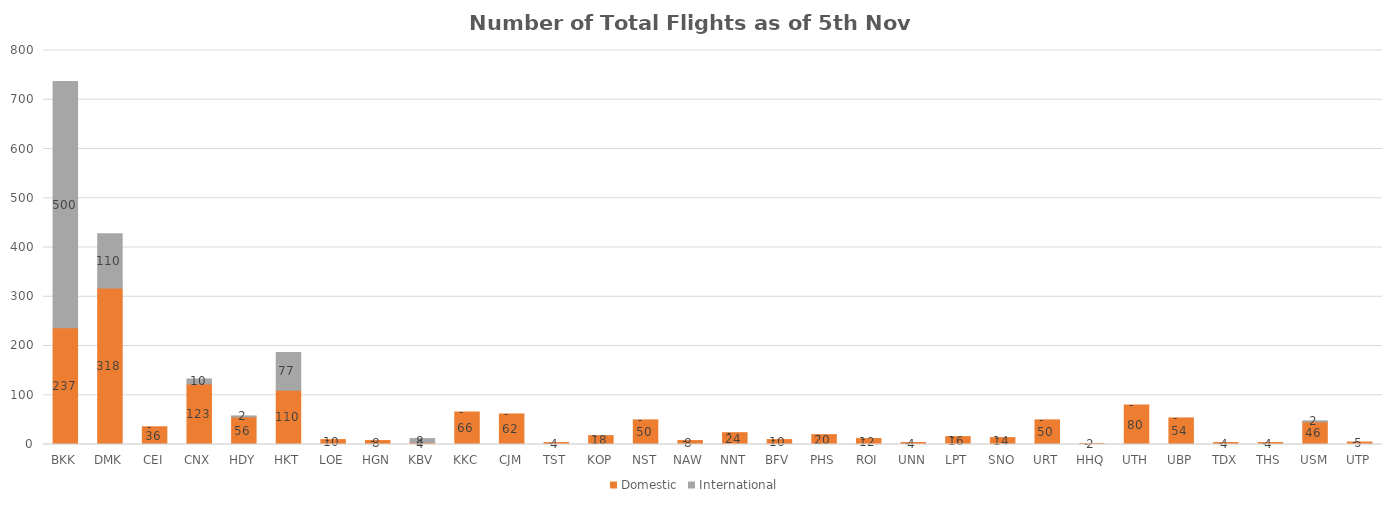
| Category | Domestic | International |
|---|---|---|
| BKK | 237 | 500 |
| DMK | 318 | 110 |
| CEI | 36 | 0 |
| CNX | 123 | 10 |
| HDY | 56 | 2 |
| HKT | 110 | 77 |
| LOE | 10 | 0 |
| HGN | 8 | 0 |
| KBV | 4 | 8 |
| KKC | 66 | 0 |
| CJM | 62 | 0 |
| TST | 4 | 0 |
| KOP | 18 | 0 |
| NST | 50 | 0 |
| NAW | 8 | 0 |
| NNT | 24 | 0 |
| BFV | 10 | 0 |
| PHS | 20 | 0 |
| ROI | 12 | 0 |
| UNN | 4 | 0 |
| LPT | 16 | 0 |
| SNO | 14 | 0 |
| URT | 50 | 0 |
| HHQ | 2 | 0 |
| UTH | 80 | 0 |
| UBP | 54 | 0 |
| TDX | 4 | 0 |
| THS | 4 | 0 |
| USM | 46 | 2 |
| UTP | 5 | 0 |